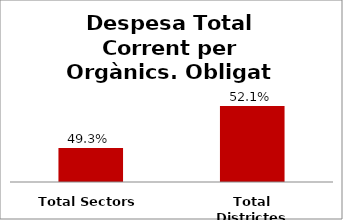
| Category | Series 0 |
|---|---|
| Total Sectors | 0.493 |
| Total Districtes | 0.521 |